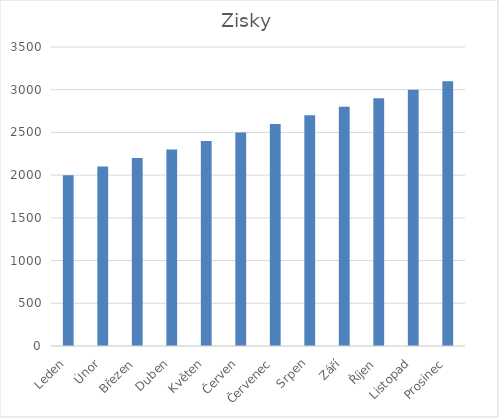
| Category | Zisky |
|---|---|
| Leden | 2000 |
| Únor | 2100 |
| Březen | 2200 |
| Duben | 2300 |
| Květen | 2400 |
| Červen | 2500 |
| Červenec | 2600 |
| Srpen | 2700 |
| Září | 2800 |
| Říjen | 2900 |
| Listopad | 3000 |
| Prosinec | 3100 |